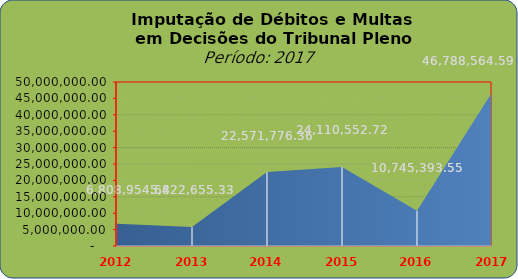
| Category | Series 0 |
|---|---|
| 2012.0 | 6808954.64 |
| 2013.0 | 5822655.33 |
| 2014.0 | 22571776.36 |
| 2015.0 | 24110552.72 |
| 2016.0 | 10745393.55 |
| 2017.0 | 46788564.59 |